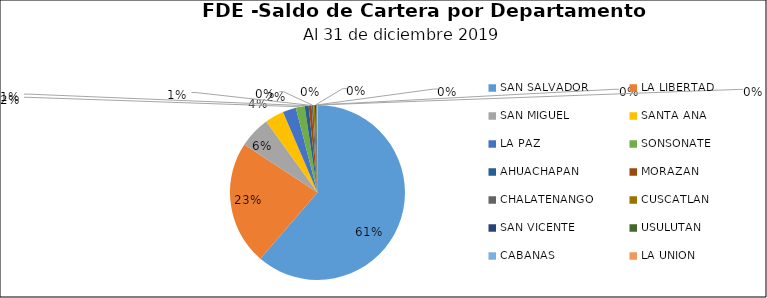
| Category | Saldo | Créditos |
|---|---|---|
| SAN SALVADOR | 28.607 | 385 |
| LA LIBERTAD | 10.687 | 147 |
| SAN MIGUEL | 2.715 | 25 |
| SANTA ANA | 1.633 | 22 |
| LA PAZ | 1.146 | 14 |
| SONSONATE | 0.762 | 26 |
| AHUACHAPAN | 0.345 | 12 |
| MORAZAN | 0.255 | 6 |
| CHALATENANGO | 0.147 | 12 |
| CUSCATLAN | 0.132 | 20 |
| SAN VICENTE | 0.094 | 3 |
| USULUTAN | 0.062 | 12 |
| CABAÑAS | 0.032 | 8 |
| LA UNION | 0.032 | 4 |